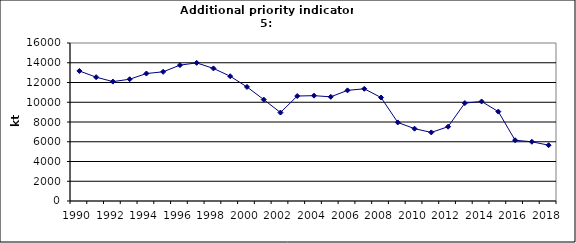
| Category | Production of oxygen steel, kt |
|---|---|
| 1990 | 13169 |
| 1991 | 12540 |
| 1992 | 12091 |
| 1993 | 12330 |
| 1994 | 12909 |
| 1995 | 13083 |
| 1996 | 13759 |
| 1997 | 13987 |
| 1998 | 13426 |
| 1999 | 12633 |
| 2000 | 11551 |
| 2001 | 10271 |
| 2002 | 8956 |
| 2003 | 10630 |
| 2004 | 10667 |
| 2005 | 10549.7 |
| 2006 | 11202.6 |
| 2007 | 11361.9 |
| 2008 | 10478 |
| 2009 | 7955 |
| 2010 | 7322.9 |
| 2011 | 6946.2 |
| 2012 | 7525.1 |
| 2013 | 9915.1 |
| 2014 | 10078.6 |
| 2015 | 9050.8 |
| 2016 | 6152.7 |
| 2017 | 5997 |
| 2018 | 5651 |